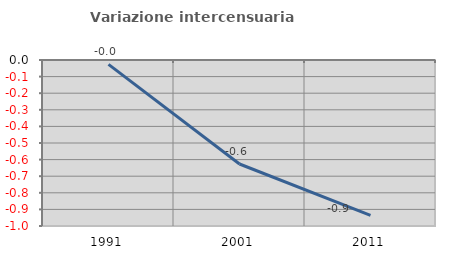
| Category | Variazione intercensuaria annua |
|---|---|
| 1991.0 | -0.027 |
| 2001.0 | -0.626 |
| 2011.0 | -0.936 |